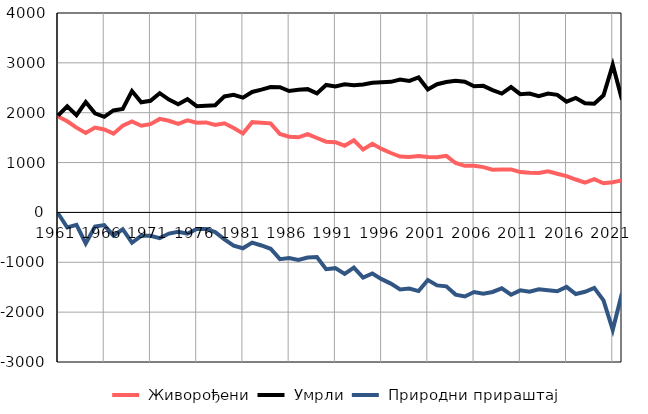
| Category |  Живорођени |  Умрли |  Природни прираштај |
|---|---|---|---|
| 1961.0 | 1926 | 1942 | -16 |
| 1962.0 | 1828 | 2130 | -302 |
| 1963.0 | 1701 | 1951 | -250 |
| 1964.0 | 1593 | 2215 | -622 |
| 1965.0 | 1703 | 1988 | -285 |
| 1966.0 | 1663 | 1918 | -255 |
| 1967.0 | 1580 | 2045 | -465 |
| 1968.0 | 1738 | 2075 | -337 |
| 1969.0 | 1826 | 2434 | -608 |
| 1970.0 | 1739 | 2208 | -469 |
| 1971.0 | 1770 | 2240 | -470 |
| 1972.0 | 1876 | 2392 | -516 |
| 1973.0 | 1839 | 2263 | -424 |
| 1974.0 | 1778 | 2168 | -390 |
| 1975.0 | 1846 | 2272 | -426 |
| 1976.0 | 1800 | 2132 | -332 |
| 1977.0 | 1805 | 2139 | -334 |
| 1978.0 | 1755 | 2150 | -395 |
| 1979.0 | 1787 | 2327 | -540 |
| 1980.0 | 1693 | 2360 | -667 |
| 1981.0 | 1584 | 2303 | -719 |
| 1982.0 | 1811 | 2416 | -605 |
| 1983.0 | 1800 | 2463 | -663 |
| 1984.0 | 1787 | 2516 | -729 |
| 1985.0 | 1574 | 2511 | -937 |
| 1986.0 | 1520 | 2435 | -915 |
| 1987.0 | 1507 | 2462 | -955 |
| 1988.0 | 1569 | 2473 | -904 |
| 1989.0 | 1493 | 2388 | -895 |
| 1990.0 | 1419 | 2557 | -1138 |
| 1991.0 | 1408 | 2526 | -1118 |
| 1992.0 | 1338 | 2571 | -1233 |
| 1993.0 | 1446 | 2551 | -1105 |
| 1994.0 | 1261 | 2567 | -1306 |
| 1995.0 | 1376 | 2601 | -1225 |
| 1996.0 | 1274 | 2612 | -1338 |
| 1997.0 | 1192 | 2619 | -1427 |
| 1998.0 | 1121 | 2667 | -1546 |
| 1999.0 | 1111 | 2638 | -1527 |
| 2000.0 | 1130 | 2708 | -1578 |
| 2001.0 | 1112 | 2467 | -1355 |
| 2002.0 | 1109 | 2572 | -1463 |
| 2003.0 | 1134 | 2617 | -1483 |
| 2004.0 | 992 | 2640 | -1648 |
| 2005.0 | 935 | 2621 | -1686 |
| 2006.0 | 934 | 2530 | -1596 |
| 2007.0 | 909 | 2539 | -1630 |
| 2008.0 | 858 | 2453 | -1595 |
| 2009.0 | 861 | 2384 | -1523 |
| 2010.0 | 863 | 2514 | -1651 |
| 2011.0 | 809 | 2372 | -1563 |
| 2012.0 | 794 | 2383 | -1589 |
| 2013.0 | 790 | 2330 | -1540 |
| 2014.0 | 824 | 2385 | -1561 |
| 2015.0 | 776 | 2358 | -1582 |
| 2016.0 | 728 | 2221 | -1493 |
| 2017.0 | 660 | 2297 | -1637 |
| 2018.0 | 599 | 2190 | -1591 |
| 2019.0 | 669 | 2182 | -1513 |
| 2020.0 | 584 | 2349 | -1765 |
| 2021.0 | 607 | 2961 | -2354 |
| 2022.0 | 643 | 2261 | -1618 |